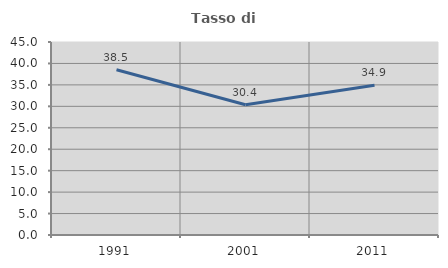
| Category | Tasso di occupazione   |
|---|---|
| 1991.0 | 38.515 |
| 2001.0 | 30.361 |
| 2011.0 | 34.935 |